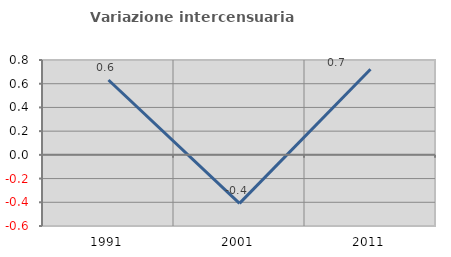
| Category | Variazione intercensuaria annua |
|---|---|
| 1991.0 | 0.631 |
| 2001.0 | -0.409 |
| 2011.0 | 0.722 |